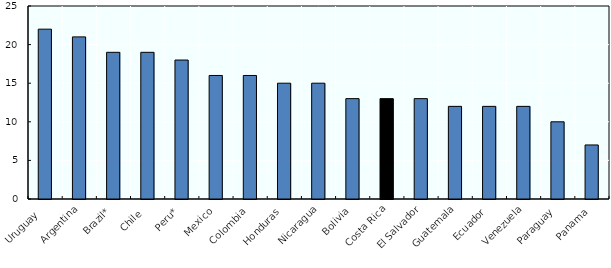
| Category | VAT rates in 2016 |
|---|---|
| Uruguay  | 22 |
| Argentina | 21 |
| Brazil* | 19 |
| Chile  | 19 |
| Peru* | 18 |
| Mexico | 16 |
| Colombia | 16 |
| Honduras | 15 |
| Nicaragua | 15 |
| Bolivia | 13 |
| Costa Rica | 13 |
| El Salvador | 13 |
| Guatemala | 12 |
| Ecuador | 12 |
| Venezuela | 12 |
| Paraguay | 10 |
| Panama | 7 |